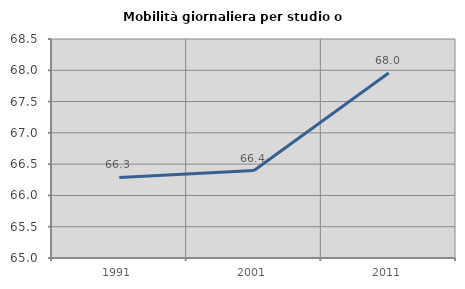
| Category | Mobilità giornaliera per studio o lavoro |
|---|---|
| 1991.0 | 66.288 |
| 2001.0 | 66.398 |
| 2011.0 | 67.957 |